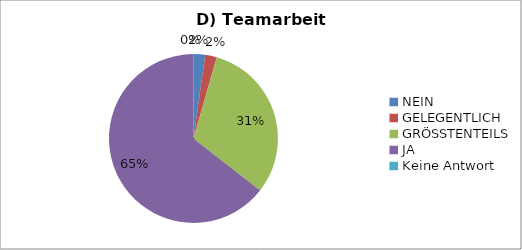
| Category | Series 0 |
|---|---|
| NEIN | 1 |
| GELEGENTLICH | 1 |
| GRÖSSTENTEILS | 14 |
| JA | 29 |
| Keine Antwort | 0 |